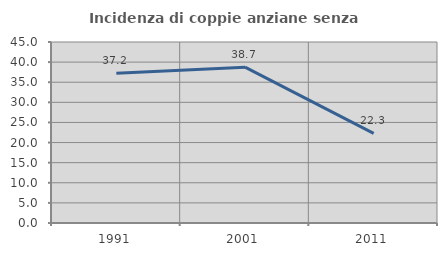
| Category | Incidenza di coppie anziane senza figli  |
|---|---|
| 1991.0 | 37.217 |
| 2001.0 | 38.739 |
| 2011.0 | 22.286 |